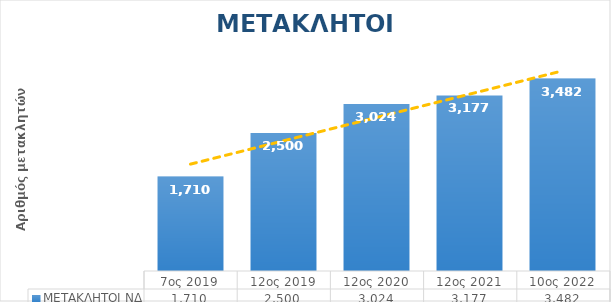
| Category | ΜΕΤΑΚΛΗΤΟΙ ΝΔ |
|---|---|
| 7ος 2019 | 1710 |
| 12ος 2019 | 2500 |
| 12ος 2020 | 3024 |
| 12ος 2021 | 3177 |
| 10ος 2022 | 3482 |